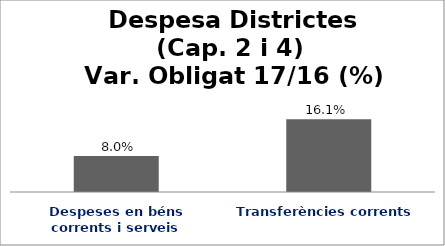
| Category | Series 0 |
|---|---|
| Despeses en béns corrents i serveis | 0.08 |
| Transferències corrents | 0.161 |